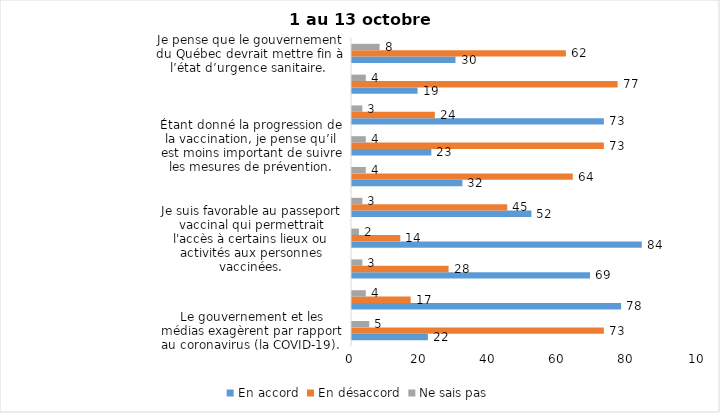
| Category | En accord | En désaccord | Ne sais pas |
|---|---|---|---|
| Le gouvernement et les médias exagèrent par rapport au coronavirus (la COVID-19). | 22 | 73 | 5 |
| J’ai peur que le système de santé soit débordé par les cas de COVID-19. | 78 | 17 | 4 |
| Je suis inquiet/inquiète  que le nombre de cas augmente en raison des nouveaux variants du virus de la COVID-19 | 69 | 28 | 3 |
| Je suis favorable au passeport vaccinal qui permettrait l'accès à certains lieux ou activités aux personnes vaccinées. | 84 | 14 | 2 |
| Si les cas de COVID-19 augmentent cet automne, je suis favorable à la mise en place de mesures de confinement (ex. fermeture de services non essentiels, interdiction des rassemblements privés) | 52 | 45 | 3 |
| Je suis favorable à ce que le port du masque ne soit plus obligatoire au Québec. | 32 | 64 | 4 |
| Étant donné la progression de la vaccination, je pense qu’il est moins important de suivre les mesures de prévention. | 23 | 73 | 4 |
| Je crois que le passeport vaccinal devrait être requis pour davantage de services et commerces (ex. : spas, centre d’achats, centre de soins personnels. | 73 | 24 | 3 |
| Je juge que les mesures contre la COVID-19 vont à l'encontre des droits et libertés individuelles.  | 19 | 77 | 4 |
| Je pense que le gouvernement du Québec devrait mettre fin à l’état d’urgence sanitaire.  | 30 | 62 | 8 |